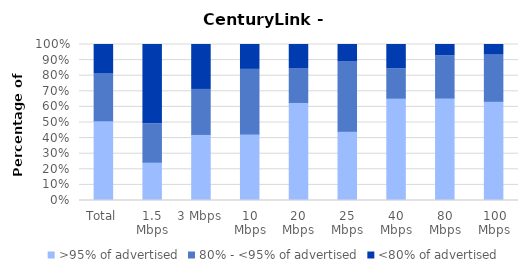
| Category | >95% of advertised | 80% - <95% of advertised | <80% of advertised |
|---|---|---|---|
| Total | 0.512 | 0.298 | 0.19 |
| 1.5 Mbps | 0.246 | 0.246 | 0.508 |
| 3 Mbps | 0.424 | 0.288 | 0.288 |
| 10 Mbps | 0.426 | 0.415 | 0.16 |
| 20 Mbps | 0.629 | 0.214 | 0.157 |
| 25 Mbps | 0.444 | 0.444 | 0.111 |
| 40 Mbps | 0.656 | 0.188 | 0.156 |
| 80 Mbps | 0.657 | 0.271 | 0.071 |
| 100 Mbps | 0.636 | 0.295 | 0.068 |